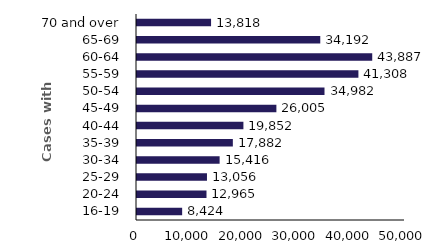
| Category | Series 0 |
|---|---|
| 16-19 | 8424 |
| 20-24 | 12965 |
| 25-29 | 13056 |
| 30-34 | 15416 |
| 35-39 | 17882 |
| 40-44 | 19852 |
| 45-49 | 26005 |
| 50-54 | 34982 |
| 55-59 | 41308 |
| 60-64 | 43887 |
| 65-69 | 34192 |
| 70 and over | 13818 |